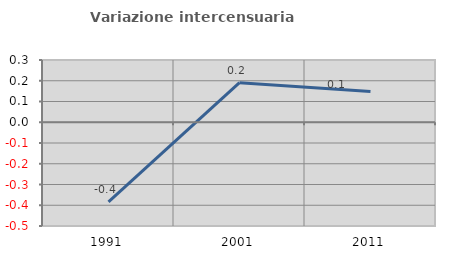
| Category | Variazione intercensuaria annua |
|---|---|
| 1991.0 | -0.384 |
| 2001.0 | 0.191 |
| 2011.0 | 0.148 |